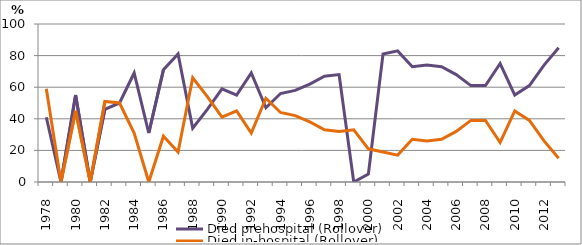
| Category | Died prehospital (Rollover) | Died in-hospital (Rollover) |
|---|---|---|
| 1978.0 | 41 | 59 |
| 1979.0 | 0 | 0 |
| 1980.0 | 55 | 45 |
| 1981.0 | 0 | 0 |
| 1982.0 | 46 | 51 |
| 1983.0 | 50 | 50 |
| 1984.0 | 69 | 31 |
| 1985.0 | 31 | 0 |
| 1986.0 | 71 | 29 |
| 1987.0 | 81 | 19 |
| 1988.0 | 34 | 66 |
| 1989.0 | 46 | 54 |
| 1990.0 | 59 | 41 |
| 1991.0 | 55 | 45 |
| 1992.0 | 69 | 31 |
| 1993.0 | 47 | 53 |
| 1994.0 | 56 | 44 |
| 1995.0 | 58 | 42 |
| 1996.0 | 62 | 38 |
| 1997.0 | 67 | 33 |
| 1998.0 | 68 | 32 |
| 1999.0 | 0 | 33 |
| 2000.0 | 5 | 21 |
| 2001.0 | 81 | 19 |
| 2002.0 | 83 | 17 |
| 2003.0 | 73 | 27 |
| 2004.0 | 74 | 26 |
| 2005.0 | 73 | 27 |
| 2006.0 | 68 | 32 |
| 2007.0 | 61 | 39 |
| 2008.0 | 61 | 39 |
| 2009.0 | 75 | 25 |
| 2010.0 | 55 | 45 |
| 2011.0 | 61 | 39 |
| 2012.0 | 74 | 26 |
| 2013.0 | 85 | 15 |